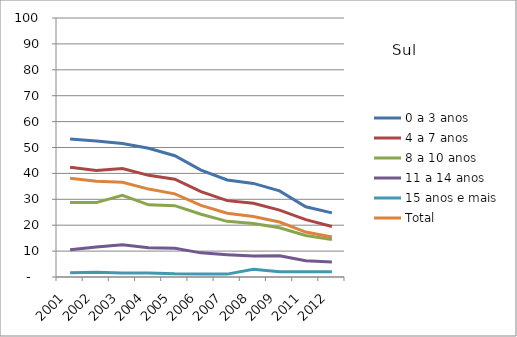
| Category | 0 a 3 anos | 4 a 7 anos | 8 a 10 anos | 11 a 14 anos | 15 anos e mais | Total |
|---|---|---|---|---|---|---|
| 2001.0 | 53.32 | 42.36 | 28.76 | 10.55 | 1.65 | 38.13 |
| 2002.0 | 52.5 | 41.16 | 28.73 | 11.59 | 1.85 | 36.93 |
| 2003.0 | 51.54 | 41.9 | 31.54 | 12.44 | 1.54 | 36.56 |
| 2004.0 | 49.68 | 39.25 | 27.85 | 11.28 | 1.57 | 33.94 |
| 2005.0 | 46.82 | 37.75 | 27.55 | 11.12 | 1.21 | 32.11 |
| 2006.0 | 41.3 | 32.98 | 24.21 | 9.32 | 1.14 | 27.62 |
| 2007.0 | 37.46 | 29.49 | 21.49 | 8.61 | 1.12 | 24.63 |
| 2008.0 | 36.14 | 28.48 | 20.67 | 8.08 | 3.03 | 23.35 |
| 2009.0 | 33.24 | 25.84 | 19.01 | 8.2 | 2.06 | 21.22 |
| 2011.0 | 27.1 | 22.15 | 16.01 | 6.29 | 2.07 | 17.34 |
| 2012.0 | 24.77 | 19.49 | 14.48 | 5.76 | 2.03 | 15.46 |